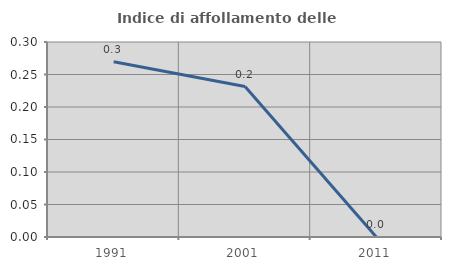
| Category | Indice di affollamento delle abitazioni  |
|---|---|
| 1991.0 | 0.27 |
| 2001.0 | 0.231 |
| 2011.0 | 0 |